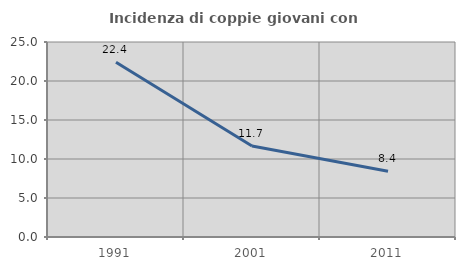
| Category | Incidenza di coppie giovani con figli |
|---|---|
| 1991.0 | 22.415 |
| 2001.0 | 11.665 |
| 2011.0 | 8.418 |